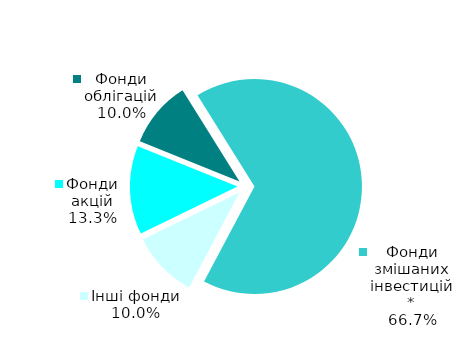
| Category | Series 0 |
|---|---|
| Фонди акцій | 4 |
| Фонди облігацій | 3 |
| Фонди змішаних інвестицій* | 20 |
| Інші фонди | 3 |